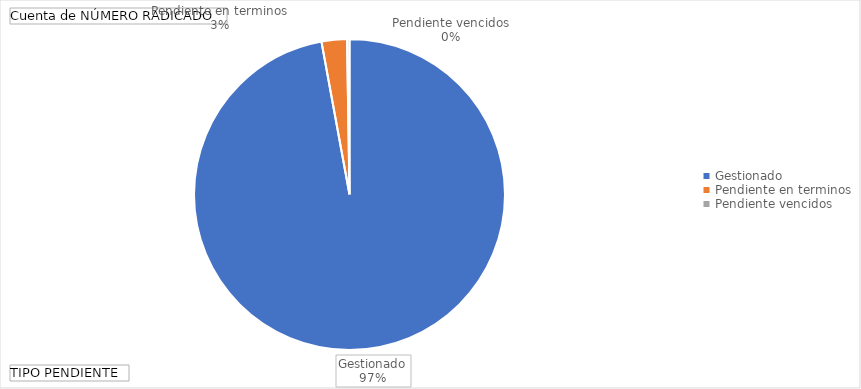
| Category | Total |
|---|---|
| Gestionado | 773 |
| Pendiente en terminos | 21 |
| Pendiente vencidos | 2 |